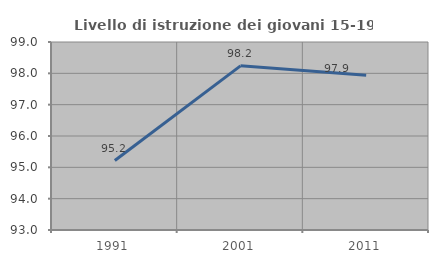
| Category | Livello di istruzione dei giovani 15-19 anni |
|---|---|
| 1991.0 | 95.217 |
| 2001.0 | 98.238 |
| 2011.0 | 97.937 |